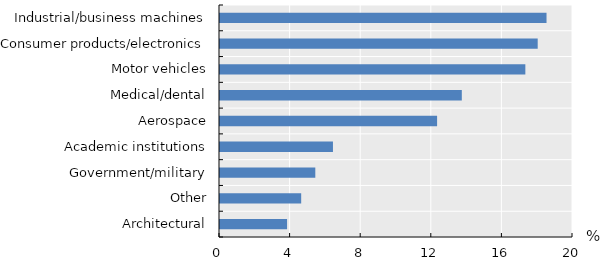
| Category | Series 0 |
|---|---|
| Architectural | 3.8 |
| Other | 4.6 |
| Government/military | 5.4 |
| Academic institutions | 6.4 |
| Aerospace | 12.3 |
| Medical/dental | 13.7 |
| Motor vehicles | 17.3 |
| Consumer products/electronics | 18 |
| Industrial/business machines | 18.5 |